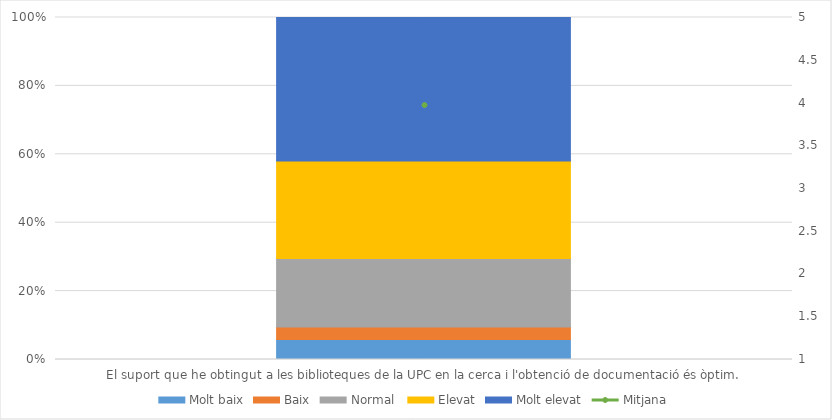
| Category | Molt baix | Baix | Normal  | Elevat | Molt elevat |
|---|---|---|---|---|---|
| El suport que he obtingut a les biblioteques de la UPC en la cerca i l'obtenció de documentació és òptim. | 16 | 10 | 55 | 78 | 115 |